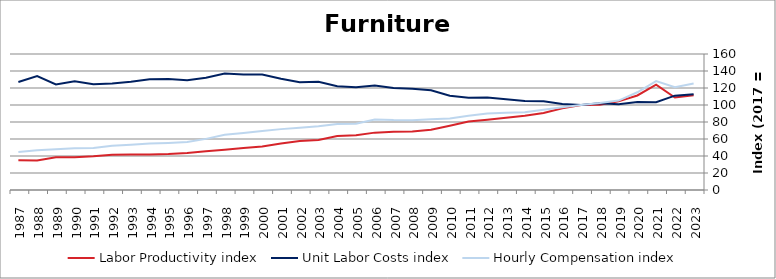
| Category | Labor Productivity index | Unit Labor Costs index | Hourly Compensation index |
|---|---|---|---|
| 2023.0 | 111.331 | 112.591 | 125.348 |
| 2022.0 | 108.843 | 111.022 | 120.839 |
| 2021.0 | 123.886 | 103.374 | 128.066 |
| 2020.0 | 111.199 | 103.398 | 114.977 |
| 2019.0 | 104.24 | 100.887 | 105.164 |
| 2018.0 | 100.185 | 102.081 | 102.27 |
| 2017.0 | 100 | 100 | 100 |
| 2016.0 | 96.272 | 101.202 | 97.429 |
| 2015.0 | 90.576 | 104.383 | 94.546 |
| 2014.0 | 87.32 | 104.799 | 91.511 |
| 2013.0 | 85.119 | 106.837 | 90.939 |
| 2012.0 | 82.712 | 108.704 | 89.911 |
| 2011.0 | 80.563 | 108.407 | 87.336 |
| 2010.0 | 75.678 | 110.976 | 83.985 |
| 2009.0 | 70.867 | 117.272 | 83.106 |
| 2008.0 | 68.9 | 119.253 | 82.165 |
| 2007.0 | 68.602 | 119.877 | 82.238 |
| 2006.0 | 67.491 | 122.811 | 82.886 |
| 2005.0 | 64.474 | 120.901 | 77.95 |
| 2004.0 | 63.65 | 121.986 | 77.644 |
| 2003.0 | 58.939 | 127.37 | 75.071 |
| 2002.0 | 57.727 | 126.657 | 73.115 |
| 2001.0 | 54.745 | 130.818 | 71.617 |
| 2000.0 | 51.173 | 135.821 | 69.504 |
| 1999.0 | 49.335 | 135.949 | 67.07 |
| 1998.0 | 47.46 | 136.927 | 64.986 |
| 1997.0 | 45.561 | 131.993 | 60.137 |
| 1996.0 | 43.672 | 129.084 | 56.374 |
| 1995.0 | 42.424 | 130.631 | 55.418 |
| 1994.0 | 41.889 | 130.416 | 54.63 |
| 1993.0 | 41.799 | 127.402 | 53.252 |
| 1992.0 | 41.459 | 125.283 | 51.941 |
| 1991.0 | 39.677 | 124.417 | 49.365 |
| 1990.0 | 38.47 | 127.875 | 49.194 |
| 1989.0 | 38.533 | 124.206 | 47.86 |
| 1988.0 | 34.836 | 134.046 | 46.696 |
| 1987.0 | 35.122 | 127.139 | 44.654 |